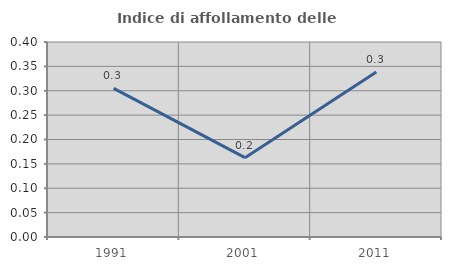
| Category | Indice di affollamento delle abitazioni  |
|---|---|
| 1991.0 | 0.305 |
| 2001.0 | 0.163 |
| 2011.0 | 0.338 |